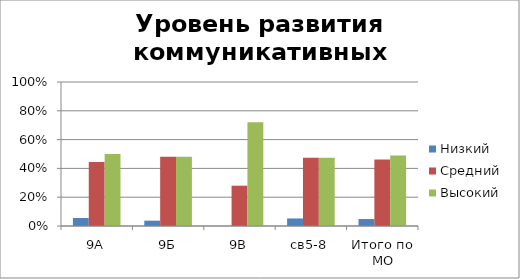
| Category | Низкий | Средний | Высокий |
|---|---|---|---|
| 9А | 0.056 | 0.444 | 0.5 |
| 9Б | 0.037 | 0.481 | 0.481 |
| 9В | 0 | 0.28 | 0.72 |
| св5-8 | 0.052 | 0.474 | 0.474 |
| Итого по МО | 0.048 | 0.461 | 0.49 |